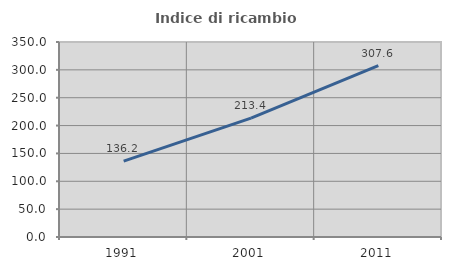
| Category | Indice di ricambio occupazionale  |
|---|---|
| 1991.0 | 136.17 |
| 2001.0 | 213.445 |
| 2011.0 | 307.639 |